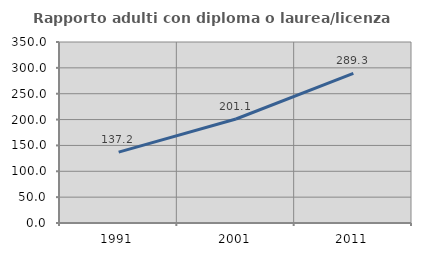
| Category | Rapporto adulti con diploma o laurea/licenza media  |
|---|---|
| 1991.0 | 137.153 |
| 2001.0 | 201.064 |
| 2011.0 | 289.286 |